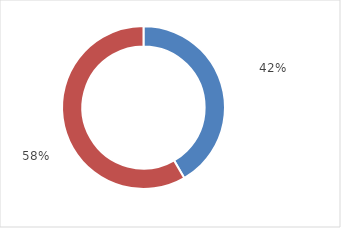
| Category | Series 0 |
|---|---|
| 0 | 0.417 |
| 1 | 0.583 |